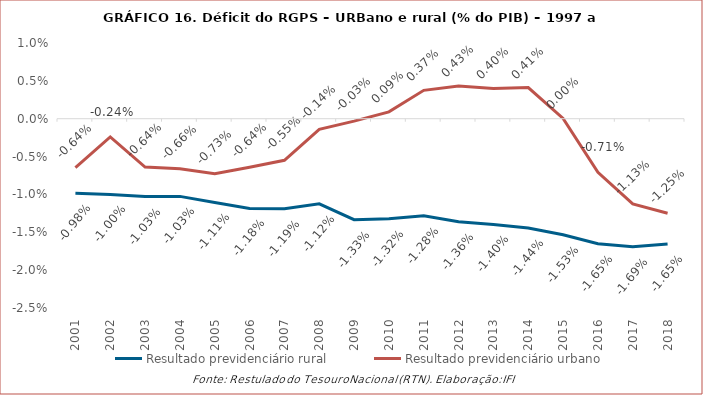
| Category | Resultado previdenciário rural | Resultado previdenciário urbano |
|---|---|---|
| 2001.0 | -0.01 | -0.006 |
| 2002.0 | -0.01 | -0.002 |
| 2003.0 | -0.01 | -0.006 |
| 2004.0 | -0.01 | -0.007 |
| 2005.0 | -0.011 | -0.007 |
| 2006.0 | -0.012 | -0.006 |
| 2007.0 | -0.012 | -0.005 |
| 2008.0 | -0.011 | -0.001 |
| 2009.0 | -0.013 | 0 |
| 2010.0 | -0.013 | 0.001 |
| 2011.0 | -0.013 | 0.004 |
| 2012.0 | -0.014 | 0.004 |
| 2013.0 | -0.014 | 0.004 |
| 2014.0 | -0.014 | 0.004 |
| 2015.0 | -0.015 | 0 |
| 2016.0 | -0.017 | -0.007 |
| 2017.0 | -0.017 | -0.011 |
| 2018.0 | -0.017 | -0.012 |